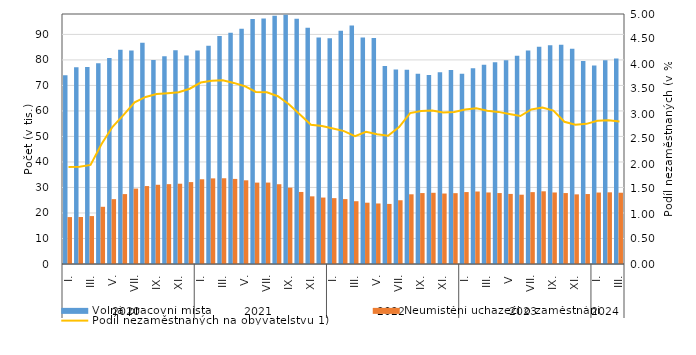
| Category | Volná pracovní místa | Neumístění uchazeči o zaměstnání |
|---|---|---|
| 0 | 73987 | 18390 |
| 1 | 77123 | 18423 |
| 2 | 77251 | 18788 |
| 3 | 78679 | 22421 |
| 4 | 80742 | 25424 |
| 5 | 83969 | 27405 |
| 6 | 83672 | 29567 |
| 7 | 86744 | 30556 |
| 8 | 79961 | 31056 |
| 9 | 81479 | 31302 |
| 10 | 83826 | 31473 |
| 11 | 81719 | 32107 |
| 12 | 83735 | 33217 |
| 13 | 85524 | 33565 |
| 14 | 89385 | 33612 |
| 15 | 90690 | 33352 |
| 16 | 92204 | 32808 |
| 17 | 96081 | 31905 |
| 18 | 96249 | 31917 |
| 19 | 97288 | 31271 |
| 20 | 97734 | 29926 |
| 21 | 96137 | 28242 |
| 22 | 92587 | 26521 |
| 23 | 88785 | 26047 |
| 24 | 88536 | 25817 |
| 25 | 91403 | 25444 |
| 26 | 93541 | 24612 |
| 27 | 88791 | 24028 |
| 28 | 88625 | 23728 |
| 29 | 77627 | 23550 |
| 30 | 76207 | 24989 |
| 31 | 76110 | 27326 |
| 32 | 74541 | 27809 |
| 33 | 74117 | 27914 |
| 34 | 75125 | 27625 |
| 35 | 76045 | 27766 |
| 36 | 74577 | 28199 |
| 37 | 76736 | 28419 |
| 38 | 78112 | 28041 |
| 39 | 79054 | 27810 |
| 40 | 79846 | 27469 |
| 41 | 81683 | 27164 |
| 42 | 83644 | 28176 |
| 43 | 85142 | 28501 |
| 44 | 85733 | 28039 |
| 45 | 85989 | 27808 |
| 46 | 84332 | 27298 |
| 47 | 79569 | 27425 |
| 48 | 77837 | 28013 |
| 49 | 79917 | 28099 |
| 50 | 80544 | 27936 |